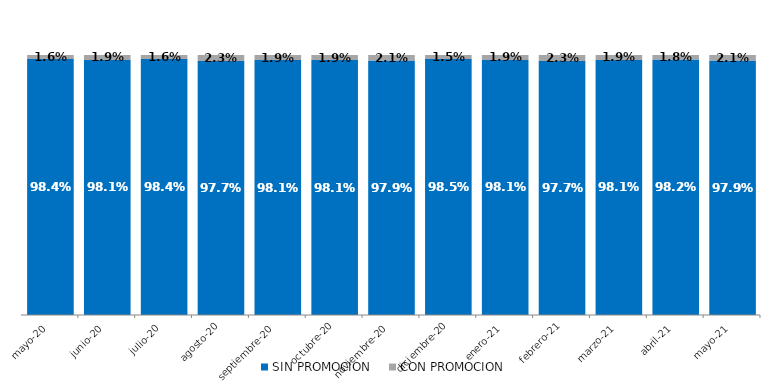
| Category | SIN PROMOCION   | CON PROMOCION   |
|---|---|---|
| 2020-05-01 | 0.984 | 0.016 |
| 2020-06-01 | 0.981 | 0.019 |
| 2020-07-01 | 0.984 | 0.016 |
| 2020-08-01 | 0.977 | 0.023 |
| 2020-09-01 | 0.981 | 0.019 |
| 2020-10-01 | 0.981 | 0.019 |
| 2020-11-01 | 0.979 | 0.021 |
| 2020-12-01 | 0.985 | 0.015 |
| 2021-01-01 | 0.981 | 0.019 |
| 2021-02-01 | 0.977 | 0.023 |
| 2021-03-01 | 0.981 | 0.019 |
| 2021-04-01 | 0.982 | 0.018 |
| 2021-05-01 | 0.979 | 0.021 |